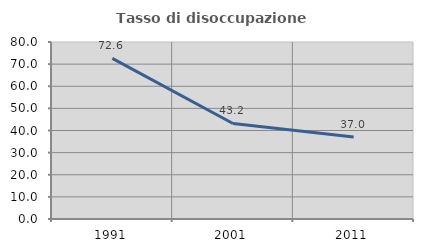
| Category | Tasso di disoccupazione giovanile  |
|---|---|
| 1991.0 | 72.603 |
| 2001.0 | 43.182 |
| 2011.0 | 37.037 |